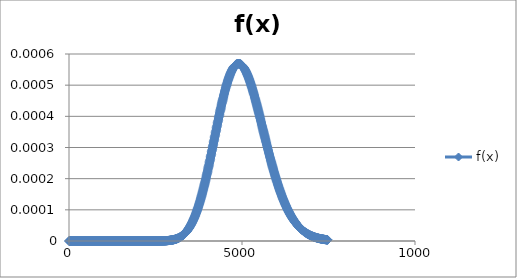
| Category | f(x) |
|---|---|
| 1e-10 | 0 |
| 7.472462639051835 | 0 |
| 14.94492527800367 | 0 |
| 22.417387916955505 | 0 |
| 29.88985055590734 | 0 |
| 37.362313194859176 | 0 |
| 44.83477583381101 | 0 |
| 52.30723847276284 | 0 |
| 59.77970111171467 | 0 |
| 67.25216375066651 | 0 |
| 74.72462638961835 | 0 |
| 82.19708902857019 | 0 |
| 89.66955166752203 | 0 |
| 97.14201430647387 | 0 |
| 104.61447694542571 | 0 |
| 112.08693958437755 | 0 |
| 119.55940222332939 | 0 |
| 127.03186486228122 | 0 |
| 134.50432750123306 | 0 |
| 141.9767901401849 | 0 |
| 149.44925277913674 | 0 |
| 156.92171541808858 | 0 |
| 164.39417805704042 | 0 |
| 171.86664069599226 | 0 |
| 179.3391033349441 | 0 |
| 186.81156597389594 | 0 |
| 194.28402861284778 | 0 |
| 201.75649125179962 | 0 |
| 209.22895389075146 | 0 |
| 216.7014165297033 | 0 |
| 224.17387916865513 | 0 |
| 231.64634180760697 | 0 |
| 239.1188044465588 | 0 |
| 246.59126708551065 | 0 |
| 254.0637297244625 | 0 |
| 261.53619236341433 | 0 |
| 269.00865500236614 | 0 |
| 276.48111764131795 | 0 |
| 283.95358028026976 | 0 |
| 291.4260429192216 | 0 |
| 298.8985055581734 | 0 |
| 306.3709681971252 | 0 |
| 313.843430836077 | 0 |
| 321.3158934750288 | 0 |
| 328.7883561139806 | 0 |
| 336.26081875293244 | 0 |
| 343.73328139188425 | 0 |
| 351.20574403083606 | 0 |
| 358.67820666978787 | 0 |
| 366.1506693087397 | 0 |
| 373.6231319476915 | 0 |
| 381.0955945866433 | 0 |
| 388.5680572255951 | 0 |
| 396.0405198645469 | 0 |
| 403.51298250349873 | 0 |
| 410.98544514245054 | 0 |
| 418.45790778140235 | 0 |
| 425.93037042035417 | 0 |
| 433.402833059306 | 0 |
| 440.8752956982578 | 0 |
| 448.3477583372096 | 0 |
| 455.8202209761614 | 0 |
| 463.2926836151132 | 0 |
| 470.76514625406503 | 0 |
| 478.23760889301684 | 0 |
| 485.71007153196865 | 0 |
| 493.18253417092046 | 0 |
| 500.6549968098723 | 0 |
| 508.1274594488241 | 0 |
| 515.5999220877759 | 0 |
| 523.0723847267277 | 0 |
| 530.5448473656795 | 0 |
| 538.0173100046313 | 0 |
| 545.4897726435831 | 0 |
| 552.962235282535 | 0 |
| 560.4346979214868 | 0 |
| 567.9071605604386 | 0 |
| 575.3796231993904 | 0 |
| 582.8520858383422 | 0 |
| 590.324548477294 | 0 |
| 597.7970111162458 | 0 |
| 605.2694737551976 | 0 |
| 612.7419363941494 | 0 |
| 620.2143990331012 | 0 |
| 627.686861672053 | 0 |
| 635.1593243110049 | 0 |
| 642.6317869499567 | 0 |
| 650.1042495889085 | 0 |
| 657.5767122278603 | 0 |
| 665.0491748668121 | 0 |
| 672.5216375057639 | 0 |
| 679.9941001447157 | 0 |
| 687.4665627836675 | 0 |
| 694.9390254226194 | 0 |
| 702.4114880615712 | 0 |
| 709.883950700523 | 0 |
| 717.3564133394748 | 0 |
| 724.8288759784266 | 0 |
| 732.3013386173784 | 0 |
| 739.7738012563302 | 0 |
| 747.246263895282 | 0 |
| 754.7187265342338 | 0 |
| 762.1911891731856 | 0 |
| 769.6636518121375 | 0 |
| 777.1361144510893 | 0 |
| 784.6085770900411 | 0 |
| 792.0810397289929 | 0 |
| 799.5535023679447 | 0 |
| 807.0259650068965 | 0 |
| 814.4984276458483 | 0 |
| 821.9708902848001 | 0 |
| 829.443352923752 | 0 |
| 836.9158155627038 | 0 |
| 844.3882782016556 | 0 |
| 851.8607408406074 | 0 |
| 859.3332034795592 | 0 |
| 866.805666118511 | 0 |
| 874.2781287574628 | 0 |
| 881.7505913964146 | 0 |
| 889.2230540353664 | 0 |
| 896.6955166743182 | 0 |
| 904.16797931327 | 0 |
| 911.6404419522219 | 0 |
| 919.1129045911737 | 0 |
| 926.5853672301255 | 0 |
| 934.0578298690773 | 0 |
| 941.5302925080291 | 0 |
| 949.0027551469809 | 0 |
| 956.4752177859327 | 0 |
| 963.9476804248845 | 0 |
| 971.4201430638363 | 0 |
| 978.8926057027882 | 0 |
| 986.36506834174 | 0 |
| 993.8375309806918 | 0 |
| 1001.3099936196436 | 0 |
| 1008.7824562585954 | 0 |
| 1016.2549188975472 | 0 |
| 1023.727381536499 | 0 |
| 1031.1998441754508 | 0 |
| 1038.6723068144026 | 0 |
| 1046.1447694533545 | 0 |
| 1053.6172320923063 | 0 |
| 1061.089694731258 | 0 |
| 1068.56215737021 | 0 |
| 1076.0346200091617 | 0 |
| 1083.5070826481135 | 0 |
| 1090.9795452870653 | 0 |
| 1098.4520079260171 | 0 |
| 1105.924470564969 | 0 |
| 1113.3969332039208 | 0 |
| 1120.8693958428726 | 0 |
| 1128.3418584818244 | 0 |
| 1135.8143211207762 | 0 |
| 1143.286783759728 | 0 |
| 1150.7592463986798 | 0 |
| 1158.2317090376316 | 0 |
| 1165.7041716765834 | 0 |
| 1173.1766343155352 | 0 |
| 1180.649096954487 | 0 |
| 1188.1215595934389 | 0 |
| 1195.5940222323907 | 0 |
| 1203.0664848713425 | 0 |
| 1210.5389475102943 | 0 |
| 1218.011410149246 | 0 |
| 1225.483872788198 | 0 |
| 1232.9563354271497 | 0 |
| 1240.4287980661015 | 0 |
| 1247.9012607050533 | 0 |
| 1255.3737233440052 | 0 |
| 1262.846185982957 | 0 |
| 1270.3186486219088 | 0 |
| 1277.7911112608606 | 0 |
| 1285.2635738998124 | 0 |
| 1292.7360365387642 | 0 |
| 1300.208499177716 | 0 |
| 1307.6809618166678 | 0 |
| 1315.1534244556196 | 0 |
| 1322.6258870945715 | 0 |
| 1330.0983497335233 | 0 |
| 1337.570812372475 | 0 |
| 1345.0432750114269 | 0 |
| 1352.5157376503787 | 0 |
| 1359.9882002893305 | 0 |
| 1367.4606629282823 | 0 |
| 1374.9331255672341 | 0 |
| 1382.405588206186 | 0 |
| 1389.8780508451378 | 0 |
| 1397.3505134840896 | 0 |
| 1404.8229761230414 | 0 |
| 1412.2954387619932 | 0 |
| 1419.767901400945 | 0 |
| 1427.2403640398968 | 0 |
| 1434.7128266788486 | 0 |
| 1442.1852893178004 | 0 |
| 1449.6577519567522 | 0 |
| 1457.130214595704 | 0 |
| 1464.6026772346559 | 0 |
| 1472.0751398736077 | 0 |
| 1479.5476025125595 | 0 |
| 1487.0200651515113 | 0 |
| 1494.492527790463 | 0 |
| 1501.964990429415 | 0 |
| 1509.4374530683667 | 0 |
| 1516.9099157073185 | 0 |
| 1524.3823783462703 | 0 |
| 1531.8548409852222 | 0 |
| 1539.327303624174 | 0 |
| 1546.7997662631258 | 0 |
| 1554.2722289020776 | 0 |
| 1561.7446915410294 | 0 |
| 1569.2171541799812 | 0 |
| 1576.689616818933 | 0 |
| 1584.1620794578848 | 0 |
| 1591.6345420968366 | 0 |
| 1599.1070047357885 | 0 |
| 1606.5794673747403 | 0 |
| 1614.051930013692 | 0 |
| 1621.5243926526439 | 0 |
| 1628.9968552915957 | 0 |
| 1636.4693179305475 | 0 |
| 1643.9417805694993 | 0 |
| 1651.4142432084511 | 0 |
| 1658.886705847403 | 0 |
| 1666.3591684863547 | 0 |
| 1673.8316311253066 | 0 |
| 1681.3040937642584 | 0 |
| 1688.7765564032102 | 0 |
| 1696.249019042162 | 0 |
| 1703.7214816811138 | 0 |
| 1711.1939443200656 | 0 |
| 1718.6664069590174 | 0 |
| 1726.1388695979692 | 0 |
| 1733.611332236921 | 0 |
| 1741.0837948758729 | 0 |
| 1748.5562575148247 | 0 |
| 1756.0287201537765 | 0 |
| 1763.5011827927283 | 0 |
| 1770.97364543168 | 0 |
| 1778.446108070632 | 0 |
| 1785.9185707095837 | 0 |
| 1793.3910333485355 | 0 |
| 1800.8634959874873 | 0 |
| 1808.3359586264392 | 0 |
| 1815.808421265391 | 0 |
| 1823.2808839043428 | 0 |
| 1830.7533465432946 | 0 |
| 1838.2258091822464 | 0 |
| 1845.6982718211982 | 0 |
| 1853.17073446015 | 0 |
| 1860.6431970991018 | 0 |
| 1868.1156597380536 | 0 |
| 1875.5881223770054 | 0 |
| 1883.0605850159573 | 0 |
| 1890.533047654909 | 0 |
| 1898.0055102938609 | 0 |
| 1905.4779729328127 | 0 |
| 1912.9504355717645 | 0 |
| 1920.4228982107163 | 0 |
| 1927.8953608496681 | 0 |
| 1935.36782348862 | 0 |
| 1942.8402861275717 | 0 |
| 1950.3127487665236 | 0 |
| 1957.7852114054754 | 0 |
| 1965.2576740444272 | 0 |
| 1972.730136683379 | 0 |
| 1980.2025993223308 | 0 |
| 1987.6750619612826 | 0 |
| 1995.1475246002344 | 0 |
| 2002.6199872391862 | 0 |
| 2010.092449878138 | 0 |
| 2017.5649125170899 | 0 |
| 2025.0373751560417 | 0 |
| 2032.5098377949935 | 0 |
| 2039.9823004339453 | 0 |
| 2047.454763072897 | 0 |
| 2054.927225711849 | 0 |
| 2062.399688350801 | 0 |
| 2069.872150989753 | 0 |
| 2077.3446136287052 | 0 |
| 2084.8170762676573 | 0 |
| 2092.2895389066093 | 0 |
| 2099.7620015455614 | 0 |
| 2107.2344641845134 | 0 |
| 2114.7069268234654 | 0 |
| 2122.1793894624175 | 0 |
| 2129.6518521013695 | 0 |
| 2137.1243147403216 | 0 |
| 2144.5967773792736 | 0 |
| 2152.0692400182256 | 0 |
| 2159.5417026571777 | 0 |
| 2167.0141652961297 | 0 |
| 2174.4866279350817 | 0 |
| 2181.959090574034 | 0 |
| 2189.431553212986 | 0 |
| 2196.904015851938 | 0 |
| 2204.37647849089 | 0 |
| 2211.848941129842 | 0 |
| 2219.321403768794 | 0 |
| 2226.793866407746 | 0 |
| 2234.266329046698 | 0 |
| 2241.73879168565 | 0 |
| 2249.211254324602 | 0 |
| 2256.683716963554 | 0 |
| 2264.156179602506 | 0 |
| 2271.6286422414582 | 0 |
| 2279.1011048804103 | 0 |
| 2286.5735675193623 | 0 |
| 2294.0460301583144 | 0 |
| 2301.5184927972664 | 0 |
| 2308.9909554362184 | 0 |
| 2316.4634180751705 | 0 |
| 2323.9358807141225 | 0 |
| 2331.4083433530745 | 0 |
| 2338.8808059920266 | 0 |
| 2346.3532686309786 | 0 |
| 2353.8257312699307 | 0 |
| 2361.2981939088827 | 0 |
| 2368.7706565478347 | 0 |
| 2376.2431191867868 | 0 |
| 2383.715581825739 | 0 |
| 2391.188044464691 | 0 |
| 2398.660507103643 | 0 |
| 2406.132969742595 | 0 |
| 2413.605432381547 | 0 |
| 2421.077895020499 | 0 |
| 2428.550357659451 | 0 |
| 2436.022820298403 | 0 |
| 2443.495282937355 | 0 |
| 2450.967745576307 | 0 |
| 2458.440208215259 | 0 |
| 2465.9126708542112 | 0 |
| 2473.3851334931633 | 0 |
| 2480.8575961321153 | 0 |
| 2488.3300587710673 | 0 |
| 2495.8025214100194 | 0 |
| 2503.2749840489714 | 0 |
| 2510.7474466879235 | 0 |
| 2518.2199093268755 | 0 |
| 2525.6923719658275 | 0 |
| 2533.1648346047796 | 0 |
| 2540.6372972437316 | 0 |
| 2548.1097598826836 | 0 |
| 2555.5822225216357 | 0 |
| 2563.0546851605877 | 0 |
| 2570.5271477995398 | 0 |
| 2577.999610438492 | 0 |
| 2585.472073077444 | 0 |
| 2592.944535716396 | 0 |
| 2600.416998355348 | 0 |
| 2607.8894609943 | 0 |
| 2615.361923633252 | 0 |
| 2622.834386272204 | 0 |
| 2630.306848911156 | 0 |
| 2637.779311550108 | 0 |
| 2645.25177418906 | 0 |
| 2652.724236828012 | 0 |
| 2660.196699466964 | 0 |
| 2667.6691621059163 | 0 |
| 2675.1416247448683 | 0 |
| 2682.6140873838203 | 0 |
| 2690.0865500227724 | 0 |
| 2697.5590126617244 | 0 |
| 2705.0314753006764 | 0 |
| 2712.5039379396285 | 0 |
| 2719.9764005785805 | 0 |
| 2727.4488632175326 | 0 |
| 2734.9213258564846 | 0 |
| 2742.3937884954366 | 0 |
| 2749.8662511343887 | 0 |
| 2757.3387137733407 | 0 |
| 2764.8111764122928 | 0 |
| 2772.283639051245 | 0 |
| 2779.756101690197 | 0 |
| 2787.228564329149 | 0 |
| 2794.701026968101 | 0 |
| 2802.173489607053 | 0 |
| 2809.645952246005 | 0 |
| 2817.118414884957 | 0 |
| 2824.590877523909 | 0 |
| 2832.063340162861 | 0 |
| 2839.535802801813 | 0 |
| 2847.008265440765 | 0 |
| 2854.480728079717 | 0 |
| 2861.9531907186692 | 0 |
| 2869.4256533576213 | 0 |
| 2876.8981159965733 | 0 |
| 2884.3705786355254 | 0 |
| 2891.8430412744774 | 0 |
| 2899.3155039134294 | 0 |
| 2906.7879665523815 | 0 |
| 2914.2604291913335 | 0 |
| 2921.7328918302856 | 0 |
| 2929.2053544692376 | 0 |
| 2936.6778171081896 | 0 |
| 2944.1502797471417 | 0 |
| 2951.6227423860937 | 0 |
| 2959.0952050250457 | 0 |
| 2966.567667663998 | 0 |
| 2974.04013030295 | 0 |
| 2981.512592941902 | 0 |
| 2988.985055580854 | 0 |
| 2996.457518219806 | 0 |
| 3003.929980858758 | 0 |
| 3011.40244349771 | 0 |
| 3018.874906136662 | 0 |
| 3026.347368775614 | 0 |
| 3033.819831414566 | 0 |
| 3041.292294053518 | 0 |
| 3048.76475669247 | 0 |
| 3056.2372193314222 | 0 |
| 3063.7096819703743 | 0 |
| 3071.1821446093263 | 0 |
| 3078.6546072482784 | 0 |
| 3086.1270698872304 | 0 |
| 3093.5995325261824 | 0 |
| 3101.0719951651345 | 0 |
| 3108.5444578040865 | 0 |
| 3116.0169204430385 | 0 |
| 3123.4893830819906 | 0 |
| 3130.9618457209426 | 0 |
| 3138.4343083598947 | 0 |
| 3145.9067709988467 | 0 |
| 3153.3792336377987 | 0 |
| 3160.8516962767508 | 0 |
| 3168.324158915703 | 0 |
| 3175.796621554655 | 0 |
| 3183.269084193607 | 0 |
| 3190.741546832559 | 0 |
| 3198.214009471511 | 0 |
| 3205.686472110463 | 0 |
| 3213.158934749415 | 0 |
| 3220.631397388367 | 0 |
| 3228.103860027319 | 0 |
| 3235.576322666271 | 0 |
| 3243.048785305223 | 0 |
| 3250.5212479441752 | 0 |
| 3257.9937105831273 | 0 |
| 3265.4661732220793 | 0 |
| 3272.9386358610313 | 0 |
| 3280.4110984999834 | 0 |
| 3287.8835611389354 | 0 |
| 3295.3560237778875 | 0 |
| 3302.8284864168395 | 0 |
| 3310.3009490557915 | 0 |
| 3317.7734116947436 | 0 |
| 3325.2458743336956 | 0 |
| 3332.7183369726476 | 0 |
| 3340.1907996115997 | 0 |
| 3347.6632622505517 | 0 |
| 3355.1357248895038 | 0 |
| 3362.608187528456 | 0 |
| 3370.080650167408 | 0 |
| 3377.55311280636 | 0 |
| 3385.025575445312 | 0 |
| 3392.498038084264 | 0 |
| 3399.970500723216 | 0 |
| 3407.442963362168 | 0 |
| 3414.91542600112 | 0 |
| 3422.387888640072 | 0 |
| 3429.860351279024 | 0 |
| 3437.332813917976 | 0 |
| 3444.805276556928 | 0 |
| 3452.2777391958803 | 0 |
| 3459.7502018348323 | 0 |
| 3467.2226644737843 | 0 |
| 3474.6951271127364 | 0 |
| 3482.1675897516884 | 0 |
| 3489.6400523906404 | 0 |
| 3497.1125150295925 | 0 |
| 3504.5849776685445 | 0 |
| 3512.0574403074966 | 0 |
| 3519.5299029464486 | 0 |
| 3527.0023655854006 | 0 |
| 3534.4748282243527 | 0 |
| 3541.9472908633047 | 0 |
| 3549.4197535022568 | 0 |
| 3556.892216141209 | 0 |
| 3564.364678780161 | 0 |
| 3571.837141419113 | 0 |
| 3579.309604058065 | 0 |
| 3586.782066697017 | 0 |
| 3594.254529335969 | 0 |
| 3601.726991974921 | 0 |
| 3609.199454613873 | 0 |
| 3616.671917252825 | 0 |
| 3624.144379891777 | 0 |
| 3631.616842530729 | 0 |
| 3639.089305169681 | 0 |
| 3646.5617678086332 | 0 |
| 3654.0342304475853 | 0 |
| 3661.5066930865373 | 0 |
| 3668.9791557254894 | 0 |
| 3676.4516183644414 | 0 |
| 3683.9240810033934 | 0 |
| 3691.3965436423455 | 0 |
| 3698.8690062812975 | 0 |
| 3706.3414689202496 | 0 |
| 3713.8139315592016 | 0 |
| 3721.2863941981536 | 0 |
| 3728.7588568371057 | 0 |
| 3736.2313194760577 | 0 |
| 3743.7037821150097 | 0 |
| 3751.176244753962 | 0 |
| 3758.648707392914 | 0 |
| 3766.121170031866 | 0 |
| 3773.593632670818 | 0 |
| 3781.06609530977 | 0 |
| 3788.538557948722 | 0 |
| 3796.011020587674 | 0 |
| 3803.483483226626 | 0 |
| 3810.955945865578 | 0 |
| 3818.42840850453 | 0 |
| 3825.900871143482 | 0 |
| 3833.373333782434 | 0 |
| 3840.8457964213862 | 0 |
| 3848.3182590603383 | 0 |
| 3855.7907216992903 | 0 |
| 3863.2631843382424 | 0 |
| 3870.7356469771944 | 0 |
| 3878.2081096161464 | 0 |
| 3885.6805722550985 | 0 |
| 3893.1530348940505 | 0 |
| 3900.6254975330025 | 0 |
| 3908.0979601719546 | 0 |
| 3915.5704228109066 | 0 |
| 3923.0428854498587 | 0 |
| 3930.5153480888107 | 0 |
| 3937.9878107277627 | 0 |
| 3945.460273366715 | 0 |
| 3952.932736005667 | 0 |
| 3960.405198644619 | 0 |
| 3967.877661283571 | 0 |
| 3975.350123922523 | 0 |
| 3982.822586561475 | 0 |
| 3990.295049200427 | 0 |
| 3997.767511839379 | 0 |
| 4005.239974478331 | 0 |
| 4012.712437117283 | 0 |
| 4020.184899756235 | 0 |
| 4027.657362395187 | 0 |
| 4035.1298250341392 | 0 |
| 4042.6022876730913 | 0 |
| 4050.0747503120433 | 0 |
| 4057.5472129509953 | 0 |
| 4065.0196755899474 | 0 |
| 4072.4921382288994 | 0 |
| 4079.9646008678515 | 0 |
| 4087.4370635068035 | 0 |
| 4094.9095261457555 | 0 |
| 4102.381988784708 | 0 |
| 4109.854451423659 | 0 |
| 4117.326914062611 | 0 |
| 4124.799376701562 | 0 |
| 4132.271839340514 | 0 |
| 4139.7443019794655 | 0 |
| 4147.216764618417 | 0 |
| 4154.689227257369 | 0 |
| 4162.16168989632 | 0 |
| 4169.634152535272 | 0 |
| 4177.106615174223 | 0 |
| 4184.579077813175 | 0 |
| 4192.051540452127 | 0 |
| 4199.524003091078 | 0 |
| 4206.99646573003 | 0 |
| 4214.468928368981 | 0 |
| 4221.941391007933 | 0 |
| 4229.4138536468845 | 0 |
| 4236.886316285836 | 0 |
| 4244.358778924788 | 0 |
| 4251.831241563739 | 0 |
| 4259.303704202691 | 0 |
| 4266.776166841642 | 0 |
| 4274.248629480594 | 0 |
| 4281.721092119546 | 0 |
| 4289.193554758497 | 0 |
| 4296.666017397449 | 0 |
| 4304.1384800364 | 0 |
| 4311.610942675352 | 0 |
| 4319.0834053143035 | 0 |
| 4326.555867953255 | 0 |
| 4334.028330592207 | 0 |
| 4341.500793231158 | 0 |
| 4348.97325587011 | 0 |
| 4356.445718509061 | 0 |
| 4363.918181148013 | 0 |
| 4371.390643786965 | 0 |
| 4378.863106425916 | 0 |
| 4386.335569064868 | 0 |
| 4393.808031703819 | 0 |
| 4401.280494342771 | 0 |
| 4408.7529569817225 | 0 |
| 4416.225419620674 | 0 |
| 4423.697882259626 | 0 |
| 4431.170344898577 | 0 |
| 4438.642807537529 | 0 |
| 4446.11527017648 | 0 |
| 4453.587732815432 | 0 |
| 4461.060195454384 | 0 |
| 4468.532658093335 | 0 |
| 4476.005120732287 | 0 |
| 4483.477583371238 | 0 |
| 4490.95004601019 | 0 |
| 4498.4225086491415 | 0 |
| 4505.894971288093 | 0 |
| 4513.367433927045 | 0 |
| 4520.839896565996 | 0 |
| 4528.312359204948 | 0 |
| 4535.784821843899 | 0 |
| 4543.257284482851 | 0 |
| 4550.729747121803 | 0 |
| 4558.202209760754 | 0.001 |
| 4565.674672399706 | 0.001 |
| 4573.147135038657 | 0.001 |
| 4580.619597677609 | 0.001 |
| 4588.0920603165605 | 0.001 |
| 4595.564522955512 | 0.001 |
| 4603.036985594464 | 0.001 |
| 4610.509448233415 | 0.001 |
| 4617.981910872367 | 0.001 |
| 4625.454373511318 | 0.001 |
| 4632.92683615027 | 0.001 |
| 4640.399298789222 | 0.001 |
| 4647.871761428173 | 0.001 |
| 4655.344224067125 | 0.001 |
| 4662.816686706076 | 0.001 |
| 4670.289149345028 | 0.001 |
| 4677.7616119839795 | 0.001 |
| 4685.234074622931 | 0.001 |
| 4692.706537261883 | 0.001 |
| 4700.178999900834 | 0.001 |
| 4707.651462539786 | 0.001 |
| 4715.123925178737 | 0.001 |
| 4722.596387817689 | 0.001 |
| 4730.068850456641 | 0.001 |
| 4737.541313095592 | 0.001 |
| 4745.013775734544 | 0.001 |
| 4752.486238373495 | 0.001 |
| 4759.958701012447 | 0.001 |
| 4767.4311636513985 | 0.001 |
| 4774.90362629035 | 0.001 |
| 4782.376088929302 | 0.001 |
| 4789.848551568253 | 0.001 |
| 4797.321014207205 | 0.001 |
| 4804.793476846156 | 0.001 |
| 4812.265939485108 | 0.001 |
| 4819.73840212406 | 0.001 |
| 4827.210864763011 | 0.001 |
| 4834.683327401963 | 0.001 |
| 4842.155790040914 | 0.001 |
| 4849.628252679866 | 0.001 |
| 4857.1007153188175 | 0.001 |
| 4864.573177957769 | 0.001 |
| 4872.045640596721 | 0.001 |
| 4879.518103235672 | 0.001 |
| 4886.990565874624 | 0.001 |
| 4894.463028513575 | 0.001 |
| 4901.935491152527 | 0.001 |
| 4909.407953791479 | 0.001 |
| 4916.88041643043 | 0.001 |
| 4924.352879069382 | 0.001 |
| 4931.825341708333 | 0.001 |
| 4939.297804347285 | 0.001 |
| 4946.7702669862365 | 0.001 |
| 4954.242729625188 | 0.001 |
| 4961.71519226414 | 0.001 |
| 4969.187654903091 | 0.001 |
| 4976.660117542043 | 0.001 |
| 4984.132580180994 | 0.001 |
| 4991.605042819946 | 0.001 |
| 4999.077505458898 | 0.001 |
| 5006.549968097849 | 0.001 |
| 5014.022430736801 | 0.001 |
| 5021.494893375752 | 0.001 |
| 5028.967356014704 | 0.001 |
| 5036.4398186536555 | 0.001 |
| 5043.912281292607 | 0.001 |
| 5051.384743931559 | 0.001 |
| 5058.85720657051 | 0.001 |
| 5066.329669209462 | 0.001 |
| 5073.802131848413 | 0.001 |
| 5081.274594487365 | 0.001 |
| 5088.747057126317 | 0.001 |
| 5096.219519765268 | 0.001 |
| 5103.69198240422 | 0.001 |
| 5111.164445043171 | 0.001 |
| 5118.636907682123 | 0.001 |
| 5126.1093703210745 | 0.001 |
| 5133.581832960026 | 0.001 |
| 5141.054295598978 | 0.001 |
| 5148.526758237929 | 0.001 |
| 5155.999220876881 | 0.001 |
| 5163.471683515832 | 0.001 |
| 5170.944146154784 | 0.001 |
| 5178.416608793736 | 0.001 |
| 5185.889071432687 | 0.001 |
| 5193.361534071639 | 0.001 |
| 5200.83399671059 | 0.001 |
| 5208.306459349542 | 0.001 |
| 5215.7789219884935 | 0.001 |
| 5223.251384627445 | 0.001 |
| 5230.723847266397 | 0.001 |
| 5238.196309905348 | 0.001 |
| 5245.6687725443 | 0.001 |
| 5253.141235183251 | 0.001 |
| 5260.613697822203 | 0.001 |
| 5268.086160461155 | 0 |
| 5275.558623100106 | 0 |
| 5283.031085739058 | 0 |
| 5290.503548378009 | 0 |
| 5297.976011016961 | 0 |
| 5305.4484736559125 | 0 |
| 5312.920936294864 | 0 |
| 5320.393398933816 | 0 |
| 5327.865861572767 | 0 |
| 5335.338324211719 | 0 |
| 5342.81078685067 | 0 |
| 5350.283249489622 | 0 |
| 5357.755712128574 | 0 |
| 5365.228174767525 | 0 |
| 5372.700637406477 | 0 |
| 5380.173100045428 | 0 |
| 5387.64556268438 | 0 |
| 5395.1180253233315 | 0 |
| 5402.590487962283 | 0 |
| 5410.062950601235 | 0 |
| 5417.535413240186 | 0 |
| 5425.007875879138 | 0 |
| 5432.480338518089 | 0 |
| 5439.952801157041 | 0 |
| 5447.425263795993 | 0 |
| 5454.897726434944 | 0 |
| 5462.370189073896 | 0 |
| 5469.842651712847 | 0 |
| 5477.315114351799 | 0 |
| 5484.7875769907505 | 0 |
| 5492.260039629702 | 0 |
| 5499.732502268654 | 0 |
| 5507.204964907605 | 0 |
| 5514.677427546557 | 0 |
| 5522.149890185508 | 0 |
| 5529.62235282446 | 0 |
| 5537.094815463412 | 0 |
| 5544.567278102363 | 0 |
| 5552.039740741315 | 0 |
| 5559.512203380266 | 0 |
| 5566.984666019218 | 0 |
| 5574.4571286581695 | 0 |
| 5581.929591297121 | 0 |
| 5589.402053936073 | 0 |
| 5596.874516575024 | 0 |
| 5604.346979213976 | 0 |
| 5611.819441852927 | 0 |
| 5619.291904491879 | 0 |
| 5626.764367130831 | 0 |
| 5634.236829769782 | 0 |
| 5641.709292408734 | 0 |
| 5649.181755047685 | 0 |
| 5656.654217686637 | 0 |
| 5664.1266803255885 | 0 |
| 5671.59914296454 | 0 |
| 5679.071605603492 | 0 |
| 5686.544068242443 | 0 |
| 5694.016530881395 | 0 |
| 5701.488993520346 | 0 |
| 5708.961456159298 | 0 |
| 5716.43391879825 | 0 |
| 5723.906381437201 | 0 |
| 5731.378844076153 | 0 |
| 5738.851306715104 | 0 |
| 5746.323769354056 | 0 |
| 5753.7962319930075 | 0 |
| 5761.268694631959 | 0 |
| 5768.741157270911 | 0 |
| 5776.213619909862 | 0 |
| 5783.686082548814 | 0 |
| 5791.158545187765 | 0 |
| 5798.631007826717 | 0 |
| 5806.103470465669 | 0 |
| 5813.57593310462 | 0 |
| 5821.048395743572 | 0 |
| 5828.520858382523 | 0 |
| 5835.993321021475 | 0 |
| 5843.4657836604265 | 0 |
| 5850.938246299378 | 0 |
| 5858.41070893833 | 0 |
| 5865.883171577281 | 0 |
| 5873.355634216233 | 0 |
| 5880.828096855184 | 0 |
| 5888.300559494136 | 0 |
| 5895.773022133088 | 0 |
| 5903.245484772039 | 0 |
| 5910.717947410991 | 0 |
| 5918.190410049942 | 0 |
| 5925.662872688894 | 0 |
| 5933.1353353278455 | 0 |
| 5940.607797966797 | 0 |
| 5948.080260605749 | 0 |
| 5955.5527232447 | 0 |
| 5963.025185883652 | 0 |
| 5970.497648522603 | 0 |
| 5977.970111161555 | 0 |
| 5985.442573800507 | 0 |
| 5992.915036439458 | 0 |
| 6000.38749907841 | 0 |
| 6007.859961717361 | 0 |
| 6015.332424356313 | 0 |
| 6022.8048869952645 | 0 |
| 6030.277349634216 | 0 |
| 6037.749812273168 | 0 |
| 6045.222274912119 | 0 |
| 6052.694737551071 | 0 |
| 6060.167200190022 | 0 |
| 6067.639662828974 | 0 |
| 6075.112125467926 | 0 |
| 6082.584588106877 | 0 |
| 6090.057050745829 | 0 |
| 6097.52951338478 | 0 |
| 6105.001976023732 | 0 |
| 6112.4744386626835 | 0 |
| 6119.946901301635 | 0 |
| 6127.419363940587 | 0 |
| 6134.891826579538 | 0 |
| 6142.36428921849 | 0 |
| 6149.836751857441 | 0 |
| 6157.309214496393 | 0 |
| 6164.781677135345 | 0 |
| 6172.254139774296 | 0 |
| 6179.726602413248 | 0 |
| 6187.199065052199 | 0 |
| 6194.671527691151 | 0 |
| 6202.1439903301025 | 0 |
| 6209.616452969054 | 0 |
| 6217.088915608006 | 0 |
| 6224.561378246957 | 0 |
| 6232.033840885909 | 0 |
| 6239.50630352486 | 0 |
| 6246.978766163812 | 0 |
| 6254.451228802764 | 0 |
| 6261.923691441715 | 0 |
| 6269.396154080667 | 0 |
| 6276.868616719618 | 0 |
| 6284.34107935857 | 0 |
| 6291.8135419975215 | 0 |
| 6299.286004636473 | 0 |
| 6306.758467275425 | 0 |
| 6314.230929914376 | 0 |
| 6321.703392553328 | 0 |
| 6329.175855192279 | 0 |
| 6336.648317831231 | 0 |
| 6344.120780470183 | 0 |
| 6351.593243109134 | 0 |
| 6359.065705748086 | 0 |
| 6366.538168387037 | 0 |
| 6374.010631025989 | 0 |
| 6381.4830936649405 | 0 |
| 6388.955556303892 | 0 |
| 6396.428018942844 | 0 |
| 6403.900481581795 | 0 |
| 6411.372944220747 | 0 |
| 6418.845406859698 | 0 |
| 6426.31786949865 | 0 |
| 6433.790332137602 | 0 |
| 6441.262794776553 | 0 |
| 6448.735257415505 | 0 |
| 6456.207720054456 | 0 |
| 6463.680182693408 | 0 |
| 6471.1526453323595 | 0 |
| 6478.625107971311 | 0 |
| 6486.097570610263 | 0 |
| 6493.570033249214 | 0 |
| 6501.042495888166 | 0 |
| 6508.514958527117 | 0 |
| 6515.987421166069 | 0 |
| 6523.459883805021 | 0 |
| 6530.932346443972 | 0 |
| 6538.404809082924 | 0 |
| 6545.877271721875 | 0 |
| 6553.349734360827 | 0 |
| 6560.8221969997785 | 0 |
| 6568.29465963873 | 0 |
| 6575.767122277682 | 0 |
| 6583.239584916633 | 0 |
| 6590.712047555585 | 0 |
| 6598.184510194536 | 0 |
| 6605.656972833488 | 0 |
| 6613.12943547244 | 0 |
| 6620.601898111391 | 0 |
| 6628.074360750343 | 0 |
| 6635.546823389294 | 0 |
| 6643.019286028246 | 0 |
| 6650.4917486671975 | 0 |
| 6657.964211306149 | 0 |
| 6665.436673945101 | 0 |
| 6672.909136584052 | 0 |
| 6680.381599223004 | 0 |
| 6687.854061861955 | 0 |
| 6695.326524500907 | 0 |
| 6702.798987139859 | 0 |
| 6710.27144977881 | 0 |
| 6717.743912417762 | 0 |
| 6725.216375056713 | 0 |
| 6732.688837695665 | 0 |
| 6740.1613003346165 | 0 |
| 6747.633762973568 | 0 |
| 6755.10622561252 | 0 |
| 6762.578688251471 | 0 |
| 6770.051150890423 | 0 |
| 6777.523613529374 | 0 |
| 6784.996076168326 | 0 |
| 6792.468538807278 | 0 |
| 6799.941001446229 | 0 |
| 6807.413464085181 | 0 |
| 6814.885926724132 | 0 |
| 6822.358389363084 | 0 |
| 6829.8308520020355 | 0 |
| 6837.303314640987 | 0 |
| 6844.775777279939 | 0 |
| 6852.24823991889 | 0 |
| 6859.720702557842 | 0 |
| 6867.193165196793 | 0 |
| 6874.665627835745 | 0 |
| 6882.138090474697 | 0 |
| 6889.610553113648 | 0 |
| 6897.0830157526 | 0 |
| 6904.555478391551 | 0 |
| 6912.027941030503 | 0 |
| 6919.5004036694545 | 0 |
| 6926.972866308406 | 0 |
| 6934.445328947358 | 0 |
| 6941.917791586309 | 0 |
| 6949.390254225261 | 0 |
| 6956.862716864212 | 0 |
| 6964.335179503164 | 0 |
| 6971.807642142116 | 0 |
| 6979.280104781067 | 0 |
| 6986.752567420019 | 0 |
| 6994.22503005897 | 0 |
| 7001.697492697922 | 0 |
| 7009.1699553368735 | 0 |
| 7016.642417975825 | 0 |
| 7024.114880614777 | 0 |
| 7031.587343253728 | 0 |
| 7039.05980589268 | 0 |
| 7046.532268531631 | 0 |
| 7054.004731170583 | 0 |
| 7061.477193809535 | 0 |
| 7068.949656448486 | 0 |
| 7076.422119087438 | 0 |
| 7083.894581726389 | 0 |
| 7091.367044365341 | 0 |
| 7098.8395070042925 | 0 |
| 7106.311969643244 | 0 |
| 7113.784432282196 | 0 |
| 7121.256894921147 | 0 |
| 7128.729357560099 | 0 |
| 7136.20182019905 | 0 |
| 7143.674282838002 | 0 |
| 7151.146745476954 | 0 |
| 7158.619208115905 | 0 |
| 7166.091670754857 | 0 |
| 7173.564133393808 | 0 |
| 7181.03659603276 | 0 |
| 7188.5090586717115 | 0 |
| 7195.981521310663 | 0 |
| 7203.453983949615 | 0 |
| 7210.926446588566 | 0 |
| 7218.398909227518 | 0 |
| 7225.871371866469 | 0 |
| 7233.343834505421 | 0 |
| 7240.816297144373 | 0 |
| 7248.288759783324 | 0 |
| 7255.761222422276 | 0 |
| 7263.233685061227 | 0 |
| 7270.706147700179 | 0 |
| 7278.1786103391305 | 0 |
| 7285.651072978082 | 0 |
| 7293.123535617034 | 0 |
| 7300.595998255985 | 0 |
| 7308.068460894937 | 0 |
| 7315.540923533888 | 0 |
| 7323.01338617284 | 0 |
| 7330.485848811792 | 0 |
| 7337.958311450743 | 0 |
| 7345.430774089695 | 0 |
| 7352.903236728646 | 0 |
| 7360.375699367598 | 0 |
| 7367.8481620065495 | 0 |
| 7375.320624645501 | 0 |
| 7382.793087284453 | 0 |
| 7390.265549923404 | 0 |
| 7397.738012562356 | 0 |
| 7405.210475201307 | 0 |
| 7412.682937840259 | 0 |
| 7420.155400479211 | 0 |
| 7427.627863118162 | 0 |
| 7435.100325757114 | 0 |
| 7442.572788396065 | 0 |
| 7450.045251035017 | 0 |
| 7457.5177136739685 | 0 |
| 7464.99017631292 | 0 |
| 7472.462638951934 | 0 |